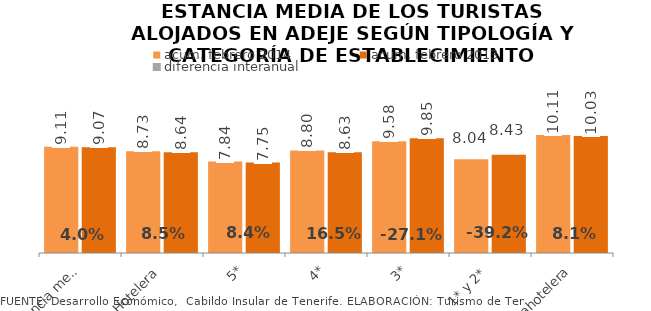
| Category | acum. febrero 2014 | acum. febrero 2013 |
|---|---|---|
| Estancia media total | 9.113 | 9.074 |
| Hotelera | 8.726 | 8.642 |
| 5* | 7.838 | 7.754 |
| 4* | 8.796 | 8.63 |
| 3* | 9.575 | 9.846 |
| 1* y 2* | 8.039 | 8.432 |
| Extrahotelera | 10.109 | 10.028 |